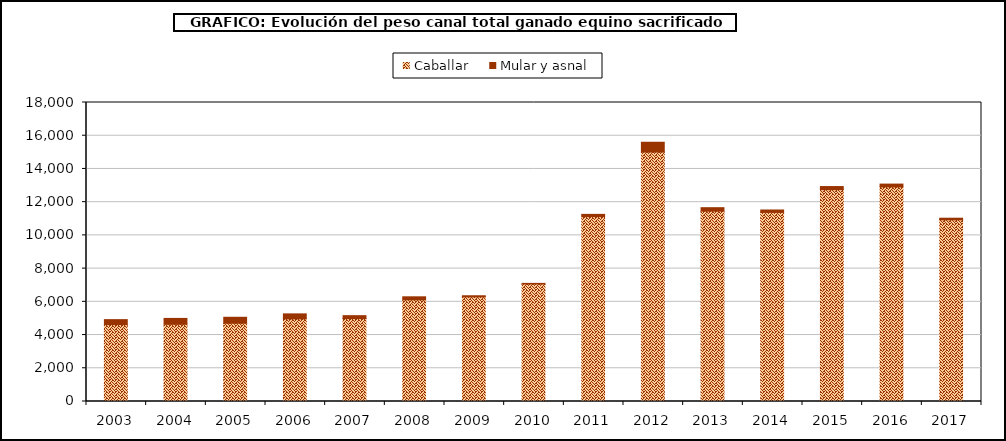
| Category | Caballar | Mular y asnal |
|---|---|---|
| 2003.0 | 4630.2 | 298.1 |
| 2004.0 | 4647.862 | 353.35 |
| 2005.0 | 4710.606 | 359.156 |
| 2006.0 | 4973.651 | 301.565 |
| 2007.0 | 4990.288 | 177.685 |
| 2008.0 | 6117.007 | 185.894 |
| 2009.0 | 6294.766 | 70.94 |
| 2010.0 | 7071.719 | 39.187 |
| 2011.0 | 11131.436 | 133.748 |
| 2012.0 | 15015.542 | 590.926 |
| 2013.0 | 11460.028 | 207.903 |
| 2014.0 | 11383.677 | 145.218 |
| 2015.0 | 12751.613 | 188.71 |
| 2016.0 | 12918.364 | 169.795 |
| 2017.0 | 10935.175 | 99.182 |